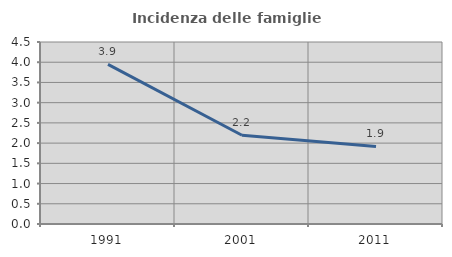
| Category | Incidenza delle famiglie numerose |
|---|---|
| 1991.0 | 3.947 |
| 2001.0 | 2.194 |
| 2011.0 | 1.919 |